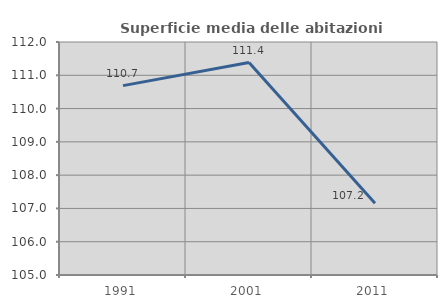
| Category | Superficie media delle abitazioni occupate |
|---|---|
| 1991.0 | 110.689 |
| 2001.0 | 111.382 |
| 2011.0 | 107.153 |